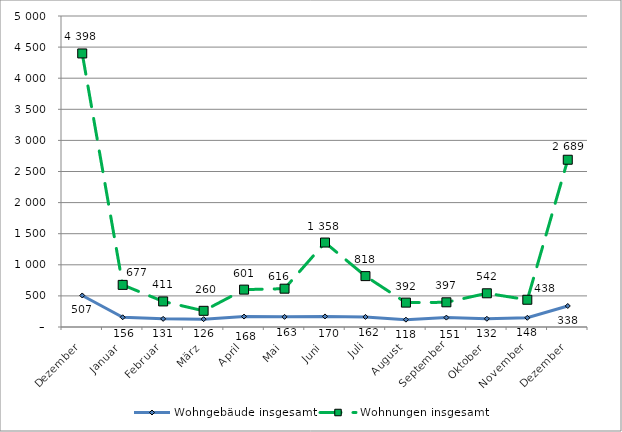
| Category | Wohngebäude insgesamt | Wohnungen insgesamt |
|---|---|---|
| Dezember | 507 | 4398 |
| Januar | 156 | 677 |
| Februar | 131 | 411 |
| März | 126 | 260 |
| April | 168 | 601 |
| Mai | 163 | 616 |
| Juni | 170 | 1358 |
| Juli | 162 | 818 |
| August | 118 | 392 |
| September | 151 | 397 |
| Oktober | 132 | 542 |
| November | 148 | 438 |
| Dezember | 338 | 2689 |